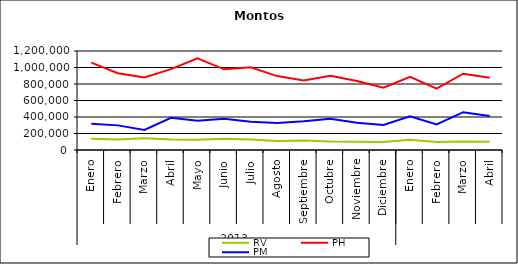
| Category | RV | PH | PM |
|---|---|---|---|
| 0 | 136808.804 | 1058774.967 | 316751.291 |
| 1 | 127193.421 | 930111.334 | 298480.292 |
| 2 | 142052.509 | 880100.908 | 242691.68 |
| 3 | 126637.277 | 980038.371 | 389833.89 |
| 4 | 123189.846 | 1112542.201 | 355777.139 |
| 5 | 135184.022 | 977877.296 | 379782.022 |
| 6 | 127790.361 | 1003315.643 | 342842.568 |
| 7 | 110532.346 | 895717.973 | 326616.455 |
| 8 | 114630.859 | 843607.598 | 348985.725 |
| 9 | 102262.08 | 901170.281 | 379642.157 |
| 10 | 99242.352 | 837424.505 | 330278.777 |
| 11 | 96243.301 | 754952.55 | 304473.582 |
| 12 | 124770.971 | 885857.327 | 408057.686 |
| 13 | 96987.292 | 744736.746 | 309218.036 |
| 14 | 103624.997 | 925209.281 | 458118.752 |
| 15 | 100007.683 | 874534.649 | 410841.727 |